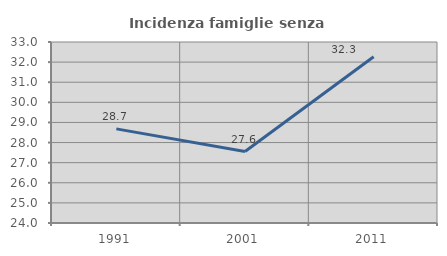
| Category | Incidenza famiglie senza nuclei |
|---|---|
| 1991.0 | 28.68 |
| 2001.0 | 27.551 |
| 2011.0 | 32.27 |